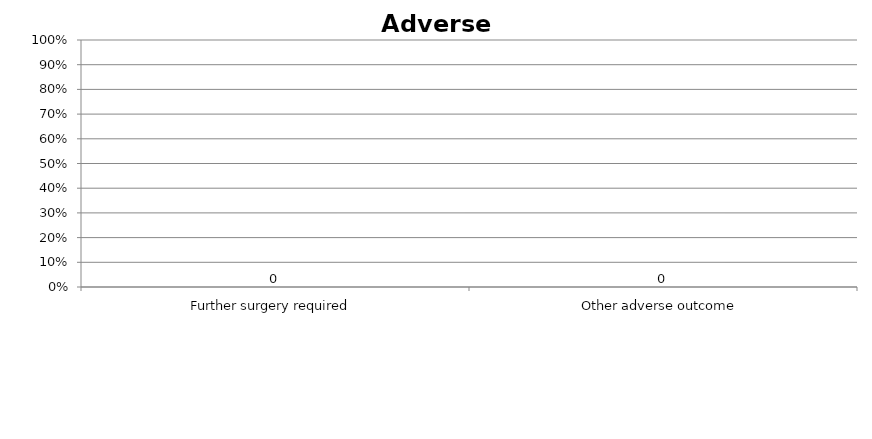
| Category | Series 0 |
|---|---|
| Further surgery required | 0 |
| Other adverse outcome | 0 |